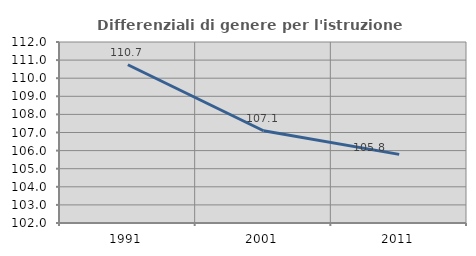
| Category | Differenziali di genere per l'istruzione superiore |
|---|---|
| 1991.0 | 110.744 |
| 2001.0 | 107.098 |
| 2011.0 | 105.791 |